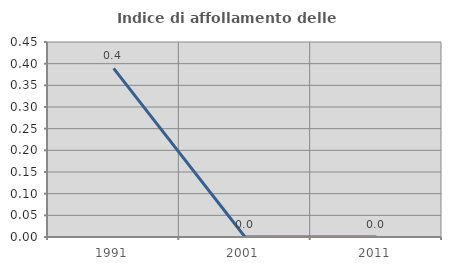
| Category | Indice di affollamento delle abitazioni  |
|---|---|
| 1991.0 | 0.389 |
| 2001.0 | 0 |
| 2011.0 | 0 |